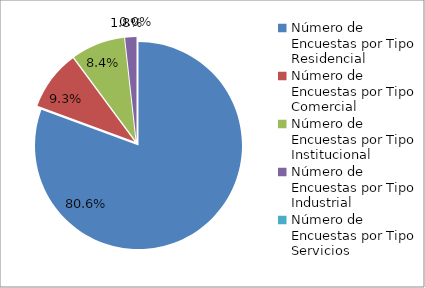
| Category | Series 0 |
|---|---|
| 0 | 183 |
| 1 | 21 |
| 2 | 19 |
| 3 | 4 |
| 4 | 0 |